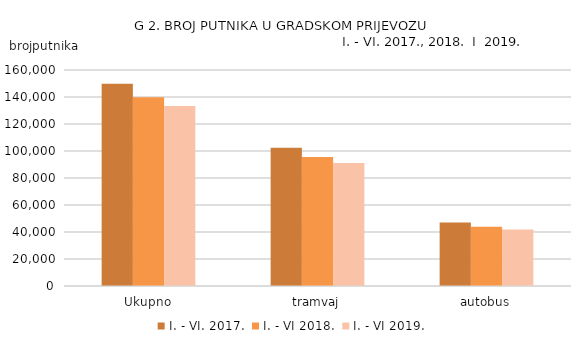
| Category | I. - VI. 2017. | I. - VI 2018. | I. - VI 2019. |
|---|---|---|---|
| Ukupno | 149748 | 139801 | 133318 |
| tramvaj | 102315 | 95518 | 91087 |
| autobus | 47059 | 43923 | 41890 |